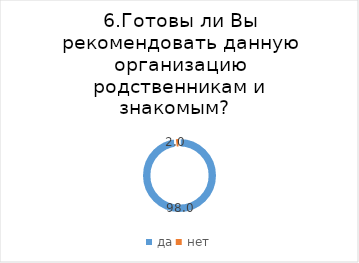
| Category | Series 0 |
|---|---|
| да | 97.959 |
| нет | 2.041 |